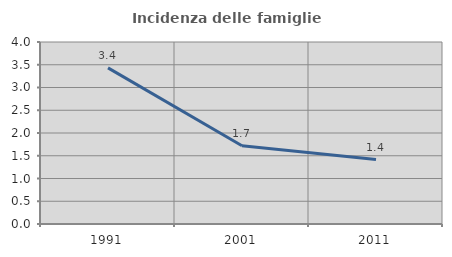
| Category | Incidenza delle famiglie numerose |
|---|---|
| 1991.0 | 3.431 |
| 2001.0 | 1.721 |
| 2011.0 | 1.416 |